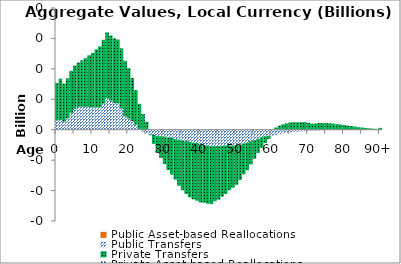
| Category | Public Asset-based Reallocations | Public Transfers | Private Transfers | Private Asset-based Reallocations |
|---|---|---|---|---|
| 0 |  | 6.096 | 24.76 |  |
|  |  | 6.287 | 27.233 |  |
| 2 |  | 5.215 | 25.073 |  |
| 3 |  | 7.521 | 26.243 |  |
| 4 |  | 11.111 | 27.53 |  |
| 5 |  | 13.807 | 28.3 |  |
| 6 |  | 15.017 | 29.134 |  |
| 7 |  | 15.16 | 30.401 |  |
| 8 |  | 15.1 | 31.945 |  |
| 9 |  | 14.974 | 33.957 |  |
| 10 |  | 14.777 | 35.755 |  |
| 11 |  | 14.651 | 38.162 |  |
| 12 |  | 14.708 | 40.116 |  |
| 13 |  | 17.136 | 41.93 |  |
| 14 |  | 20.736 | 43.263 |  |
| 15 |  | 19.079 | 42.835 |  |
| 16 |  | 17.522 | 42.59 |  |
| 17 |  | 17.382 | 41.864 |  |
| 18 |  | 13.94 | 39.533 |  |
| 19 |  | 8.816 | 36.456 |  |
| 20 |  | 7.355 | 33.138 |  |
| 21 |  | 5.643 | 28.322 |  |
| 22 |  | 3.214 | 22.788 |  |
| 23 |  | 0.471 | 16.547 |  |
| 24 |  | -1.416 | 10.398 |  |
| 25 |  | -2.562 | 5.277 |  |
| 26 |  | -3.078 | -0.545 |  |
| 27 |  | -3.499 | -5.815 |  |
| 28 |  | -4.154 | -10.645 |  |
| 29 |  | -4.301 | -14.337 |  |
| 30 |  | -4.468 | -18.233 |  |
| 31 |  | -5.186 | -21.356 |  |
| 32 |  | -5.362 | -24.078 |  |
| 33 |  | -6.113 | -26.715 |  |
| 34 |  | -6.598 | -30.273 |  |
| 35 |  | -7.036 | -32.775 |  |
| 36 |  | -7.604 | -34.608 |  |
| 37 |  | -8.057 | -36.451 |  |
| 38 |  | -8.416 | -37.325 |  |
| 39 |  | -8.75 | -37.901 |  |
| 40 |  | -9.64 | -38.243 |  |
| 41 |  | -10.175 | -37.798 |  |
| 42 |  | -10.297 | -38.393 |  |
| 43 |  | -10.889 | -38.023 |  |
| 44 |  | -10.807 | -36.207 |  |
| 45 |  | -10.659 | -35.35 |  |
| 46 |  | -10.59 | -33.37 |  |
| 47 |  | -10.338 | -31.89 |  |
| 48 |  | -10.381 | -29.351 |  |
| 49 |  | -10.53 | -27.59 |  |
| 50 |  | -10.099 | -26.149 |  |
| 51 |  | -9.735 | -23.325 |  |
| 52 |  | -9.032 | -20.288 |  |
| 53 |  | -8.52 | -18.191 |  |
| 54 |  | -7.637 | -15.168 |  |
| 55 |  | -6.884 | -12.262 |  |
| 56 |  | -5.961 | -9.335 |  |
| 57 |  | -4.952 | -6.906 |  |
| 58 |  | -4.227 | -4.49 |  |
| 59 |  | -4.053 | -1.978 |  |
| 60 |  | -3.78 | -0.109 |  |
| 61 |  | -3.485 | 1.445 |  |
| 62 |  | -2.908 | 2.735 |  |
| 63 |  | -2.431 | 3.597 |  |
| 64 |  | -2.031 | 4.131 |  |
| 65 |  | -1.783 | 4.806 |  |
| 66 |  | -1.296 | 4.935 |  |
| 67 |  | -1.18 | 4.858 |  |
| 68 |  | -1.001 | 4.927 |  |
| 69 |  | -0.874 | 4.942 |  |
| 70 |  | -0.738 | 4.493 |  |
| 71 |  | -0.683 | 3.957 |  |
| 72 |  | -0.57 | 4.041 |  |
| 73 |  | -0.51 | 4.431 |  |
| 74 |  | -0.402 | 4.325 |  |
| 75 |  | -0.327 | 4.305 |  |
| 76 |  | -0.163 | 4.216 |  |
| 77 |  | -0.044 | 3.961 |  |
| 78 |  | -0.038 | 3.645 |  |
| 79 |  | -0.023 | 3.434 |  |
| 80 |  | -0.029 | 3.062 |  |
| 81 |  | 0.01 | 2.672 |  |
| 82 |  | 0.052 | 2.347 |  |
| 83 |  | 0.062 | 1.968 |  |
| 84 |  | 0.067 | 1.595 |  |
| 85 |  | 0.073 | 1.37 |  |
| 86 |  | 0.068 | 1.106 |  |
| 87 |  | 0.06 | 0.868 |  |
| 88 |  | 0.051 | 0.68 |  |
| 89 |  | 0.042 | 0.515 |  |
| 90+ |  | 0.095 | 1.103 |  |